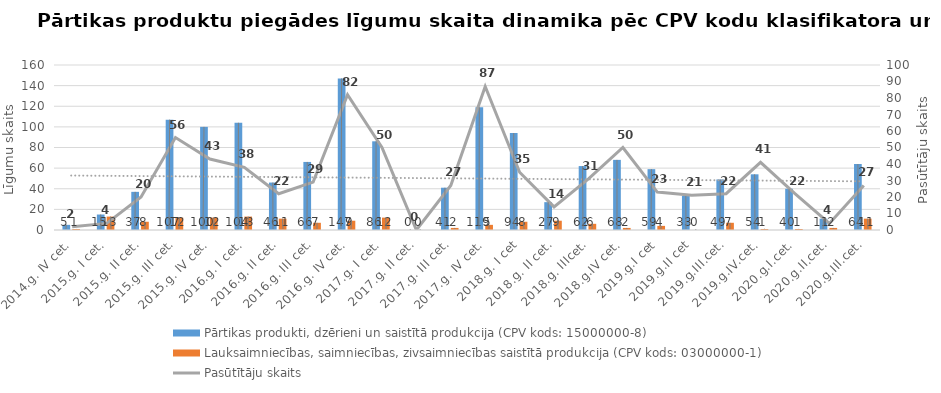
| Category | Pārtikas produkti, dzērieni un saistītā produkcija (CPV kods: 15000000-8) | Lauksaimniecības, saimniecības, zivsaimniecības saistītā produkcija (CPV kods: 03000000-1) |
|---|---|---|
| 2014.g. IV cet. | 5 | 1 |
| 2015.g. I cet. | 15 | 13 |
| 2015.g. II cet. | 37 | 8 |
| 2015.g. III cet. | 107 | 12 |
| 2015.g. IV cet. | 100 | 12 |
| 2016.g. I cet. | 104 | 13 |
| 2016.g. II cet. | 46 | 11 |
| 2016.g. III cet. | 66 | 7 |
| 2016.g. IV cet. | 147 | 9 |
| 2017.g. I cet. | 86 | 12 |
| 2017.g. II cet. | 0 | 0 |
| 2017.g. III cet. | 41 | 2 |
| 2017.g. IV cet. | 119 | 5 |
| 2018.g. I cet | 94 | 8 |
| 2018.g. II cet. | 27 | 9 |
| 2018.g. IIIcet. | 62 | 6 |
| 2018.g.IV cet. | 68 | 2 |
| 2019.g.I cet | 59 | 4 |
| 2019.g.II cet | 33 | 0 |
| 2019.g.III.cet. | 49 | 7 |
| 2019.g.IV.cet. | 54 | 1 |
| 2020.g.I.cet. | 40 | 1 |
| 2020.g.II.cet. | 11 | 2 |
| 2020.g.III.cet. | 64 | 11 |